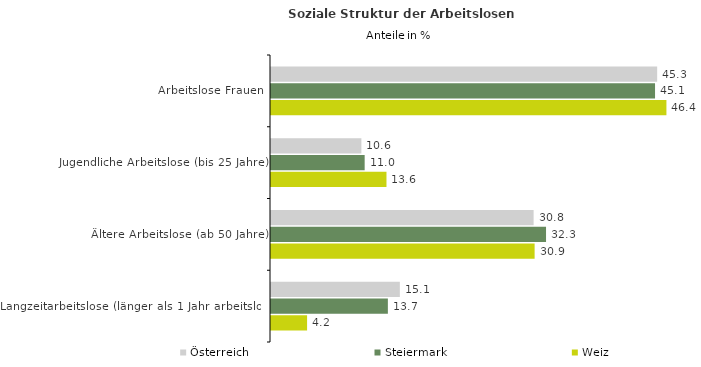
| Category | Österreich | Steiermark | Weiz |
|---|---|---|---|
| Arbeitslose Frauen | 45.325 | 45.075 | 46.411 |
| Jugendliche Arbeitslose (bis 25 Jahre) | 10.608 | 10.993 | 13.553 |
| Ältere Arbeitslose (ab 50 Jahre) | 30.822 | 32.281 | 30.941 |
| Langzeitarbeitslose (länger als 1 Jahr arbeitslos) | 15.122 | 13.717 | 4.235 |